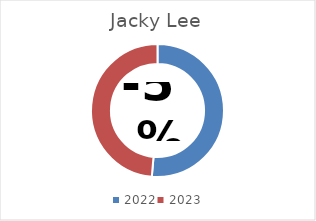
| Category | Jacky Lee |
|---|---|
| 2022.0 | 2711156 |
| 2023.0 | 2566978 |